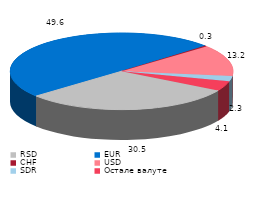
| Category | Series 0 |
|---|---|
| RSD | 30.5 |
| EUR | 49.6 |
| CHF | 0.3 |
| USD | 13.2 |
| SDR | 2.3 |
| Остале валуте | 4.1 |